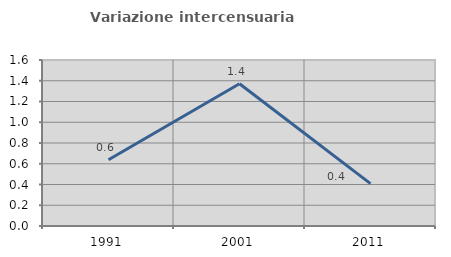
| Category | Variazione intercensuaria annua |
|---|---|
| 1991.0 | 0.638 |
| 2001.0 | 1.372 |
| 2011.0 | 0.409 |